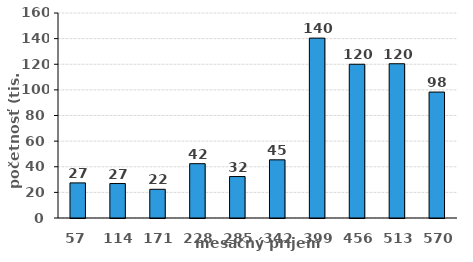
| Category | početnosť (tis. osôb) |
|---|---|
| 57.0 | 27.4 |
| 114.0 | 26.9 |
| 171.0 | 22.4 |
| 228.0 | 42.4 |
| 285.0 | 32.35 |
| 342.0 | 45.4 |
| 399.0 | 140.4 |
| 456.0 | 120 |
| 513.0 | 120.4 |
| 570.0 | 98.3 |